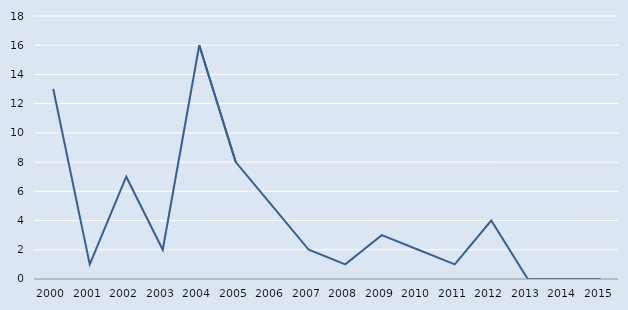
| Category | Series 0 |
|---|---|
| 2000.0 | 13 |
| 2001.0 | 1 |
| 2002.0 | 7 |
| 2003.0 | 2 |
| 2004.0 | 16 |
| 2005.0 | 8 |
| 2006.0 | 5 |
| 2007.0 | 2 |
| 2008.0 | 1 |
| 2009.0 | 3 |
| 2010.0 | 2 |
| 2011.0 | 1 |
| 2012.0 | 4 |
| 2013.0 | 0 |
| 2014.0 | 0 |
| 2015.0 | 0 |